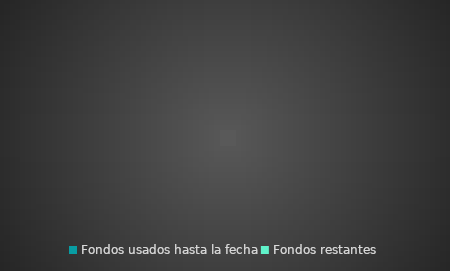
| Category | Importe |
|---|---|
| Fondos usados hasta la fecha | 0 |
| Fondos restantes | 0 |